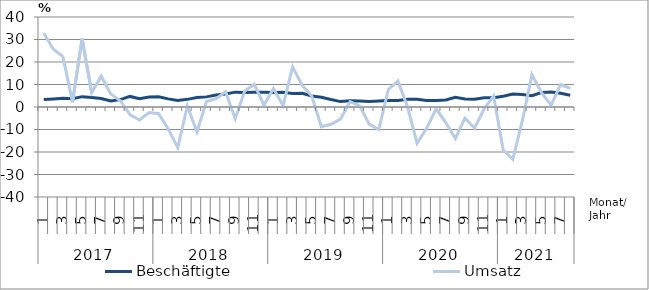
| Category | Beschäftigte | Umsatz |
|---|---|---|
| 0 | 3.3 | 32.8 |
| 1 | 3.6 | 25.7 |
| 2 | 3.9 | 22.4 |
| 3 | 3.7 | 2.1 |
| 4 | 4.6 | 30.4 |
| 5 | 4.2 | 6.4 |
| 6 | 3.8 | 13.7 |
| 7 | 2.7 | 5.8 |
| 8 | 3.3 | 2.8 |
| 9 | 4.7 | -3.4 |
| 10 | 3.7 | -5.8 |
| 11 | 4.4 | -2.5 |
| 12 | 4.5 | -3 |
| 13 | 3.6 | -9.8 |
| 14 | 2.9 | -18.1 |
| 15 | 3.4 | 0.5 |
| 16 | 4.2 | -11 |
| 17 | 4.5 | 2.5 |
| 18 | 5.3 | 3.7 |
| 19 | 5.8 | 6.8 |
| 20 | 6.6 | -5.2 |
| 21 | 6.5 | 7.1 |
| 22 | 6.6 | 10.1 |
| 23 | 6.6 | 0.8 |
| 24 | 6.4 | 8.2 |
| 25 | 6.5 | 0.6 |
| 26 | 6 | 17.8 |
| 27 | 6.1 | 9.6 |
| 28 | 4.9 | 4.9 |
| 29 | 4.3 | -8.8 |
| 30 | 3.3 | -7.7 |
| 31 | 2.4 | -5.4 |
| 32 | 2.8 | 2.4 |
| 33 | 2.7 | 0.5 |
| 34 | 2.5 | -7.6 |
| 35 | 2.7 | -10 |
| 36 | 2.9 | 7.8 |
| 37 | 2.9 | 11.5 |
| 38 | 3.4 | 0.1 |
| 39 | 3.4 | -16.1 |
| 40 | 2.9 | -9.5 |
| 41 | 2.9 | -0.8 |
| 42 | 3.1 | -6.9 |
| 43 | 4.3 | -14 |
| 44 | 3.6 | -4.9 |
| 45 | 3.4 | -9.4 |
| 46 | 4.1 | -0.9 |
| 47 | 4.1 | 4.9 |
| 48 | 4.8 | -19.1 |
| 49 | 5.8 | -23.3 |
| 50 | 5.6 | -6.1 |
| 51 | 5 | 14.4 |
| 52 | 6.4 | 6.4 |
| 53 | 6.7 | 0.8 |
| 54 | 6.1 | 10 |
| 55 | 5.2 | 8.3 |